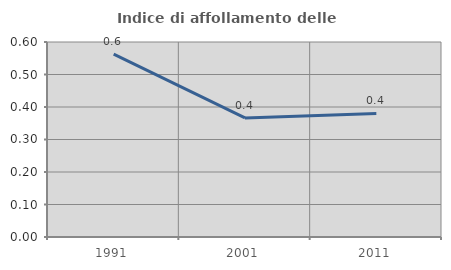
| Category | Indice di affollamento delle abitazioni  |
|---|---|
| 1991.0 | 0.563 |
| 2001.0 | 0.366 |
| 2011.0 | 0.38 |